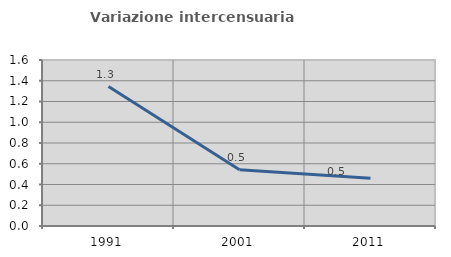
| Category | Variazione intercensuaria annua |
|---|---|
| 1991.0 | 1.344 |
| 2001.0 | 0.543 |
| 2011.0 | 0.46 |